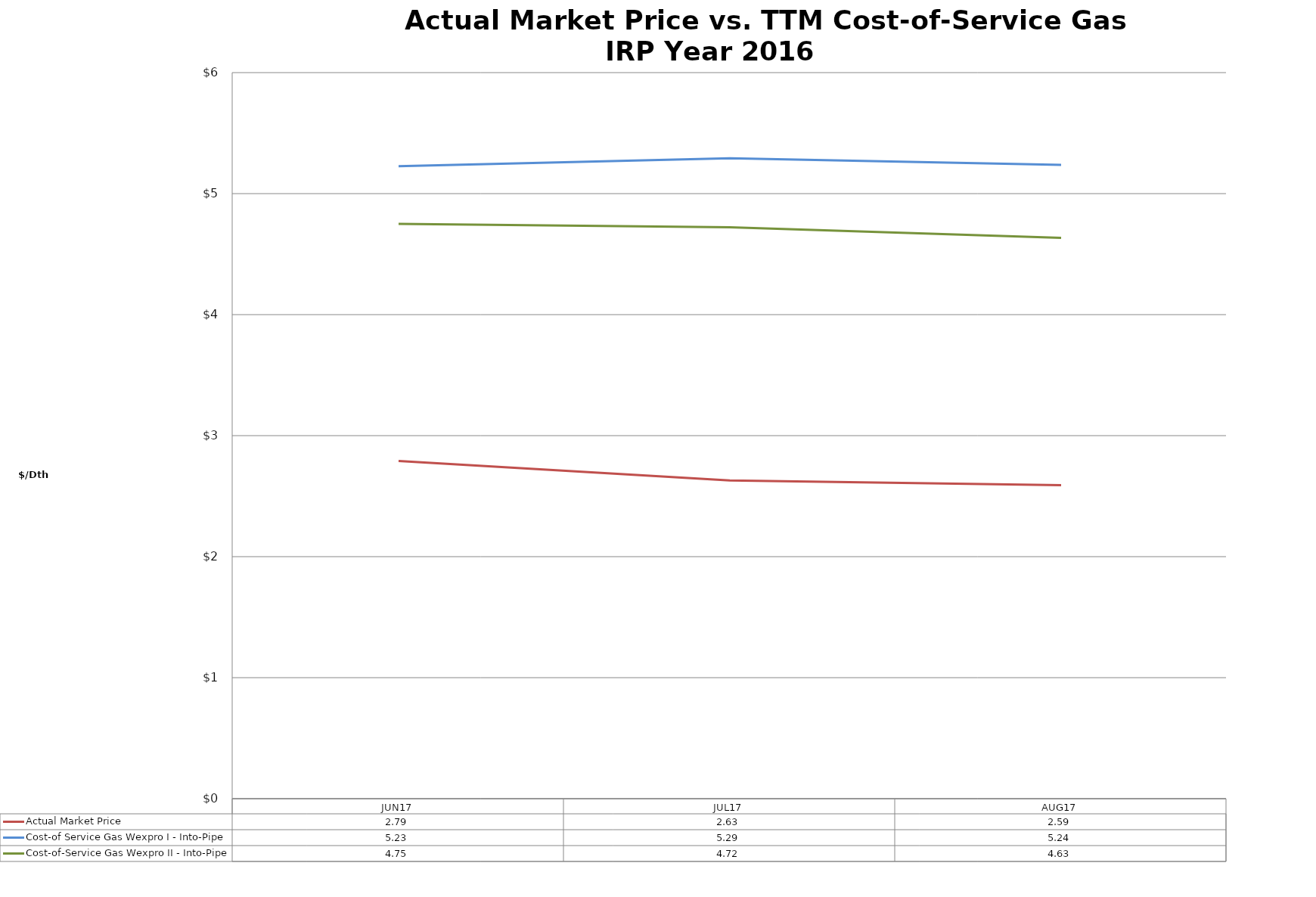
| Category | Actual Market Price | Cost-of Service Gas Wexpro I - Into-Pipe | Cost-of-Service Gas Wexpro II - Into-Pipe |
|---|---|---|---|
| JUN17 | 2.79 | 5.226 | 4.751 |
| JUL17 | 2.63 | 5.293 | 4.721 |
| AUG17 | 2.59 | 5.238 | 4.635 |